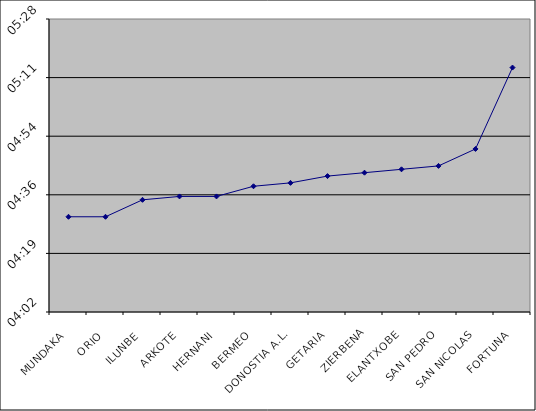
| Category | Series 0 |
|---|---|
| MUNDAKA | 0.003 |
| ORIO | 0.003 |
| ILUNBE | 0.003 |
| ARKOTE | 0.003 |
| HERNANI | 0.003 |
| BERMEO | 0.003 |
| DONOSTIA A.L. | 0.003 |
| GETARIA | 0.003 |
| ZIERBENA | 0.003 |
| ELANTXOBE | 0.003 |
| SAN PEDRO | 0.003 |
| SAN NICOLAS | 0.003 |
| FORTUNA | 0.004 |